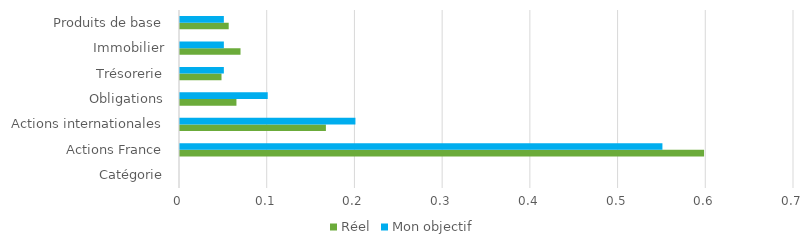
| Category | Réel | Mon objectif |
|---|---|---|
| Catégorie | 0 | 0 |
| Actions France | 0.597 | 0.55 |
| Actions internationales | 0.166 | 0.2 |
| Obligations | 0.064 | 0.1 |
| Trésorerie | 0.047 | 0.05 |
| Immobilier | 0.069 | 0.05 |
| Produits de base | 0.056 | 0.05 |